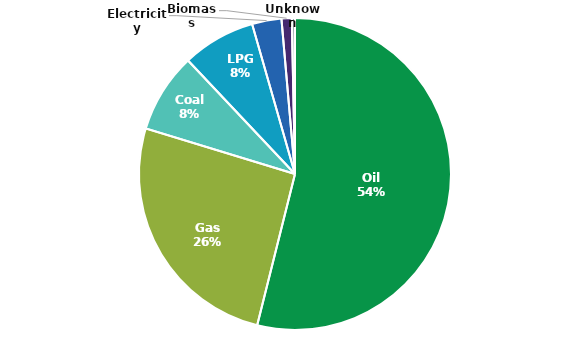
| Category | Series 0 |
|---|---|
| Oil | 0.539 |
| Gas | 0.258 |
| Coal | 0.083 |
| LPG | 0.076 |
| Electricity | 0.03 |
| Biomass | 0.011 |
| Unknown | 0.003 |